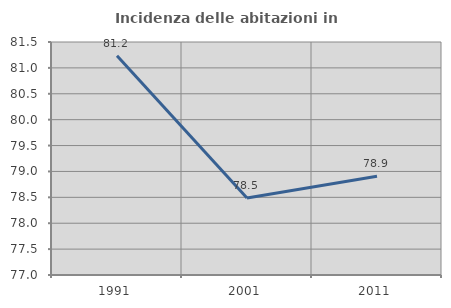
| Category | Incidenza delle abitazioni in proprietà  |
|---|---|
| 1991.0 | 81.236 |
| 2001.0 | 78.489 |
| 2011.0 | 78.908 |